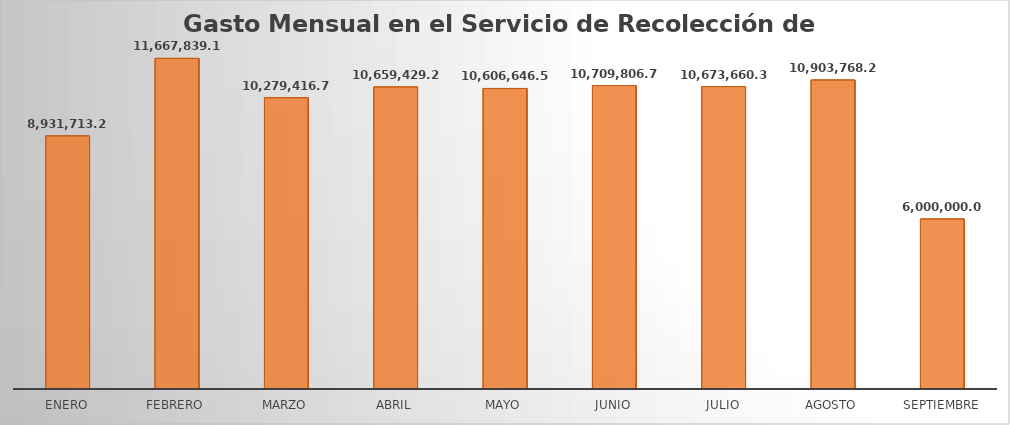
| Category | Monto |
|---|---|
| ENERO | 8931713.21 |
| FEBRERO | 11667839.16 |
| MARZO | 10279416.71 |
| ABRIL | 10659429.29 |
| MAYO | 10606646.5 |
| JUNIO | 10709806.73 |
| JULIO | 10673660.31 |
| AGOSTO | 10903768.25 |
| SEPTIEMBRE | 6000000 |